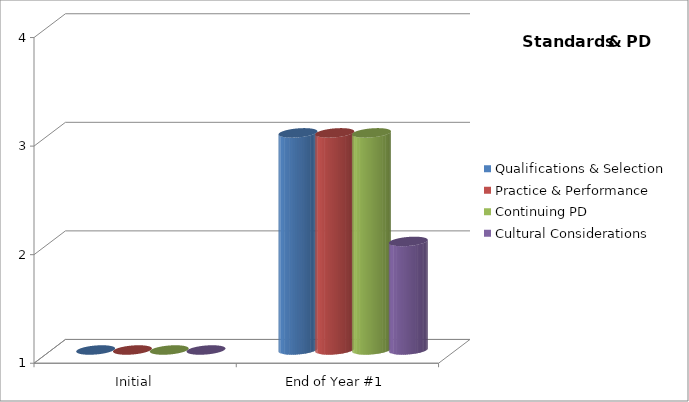
| Category | Qualifications & Selection  | Practice & Performance  | Continuing PD | Cultural Considerations  |
|---|---|---|---|---|
| Initial | 1 | 1 | 1 | 1 |
| End of Year #1 | 3 | 3 | 3 | 2 |